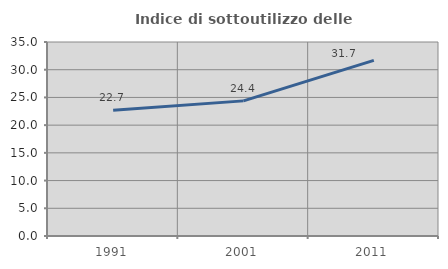
| Category | Indice di sottoutilizzo delle abitazioni  |
|---|---|
| 1991.0 | 22.667 |
| 2001.0 | 24.378 |
| 2011.0 | 31.694 |